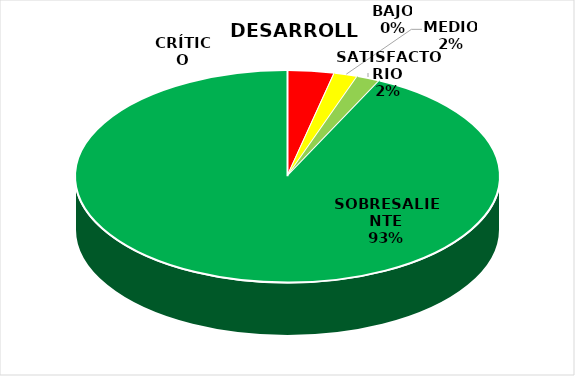
| Category | Series 2 | Series 1 | Series 0 |
|---|---|---|---|
| CRÍTICO | 2 | 0 | 2 |
| BAJO | 0 | 2 | 0 |
| MEDIO | 1 | 6 | 1 |
| SATISFACTORIO | 1 | 6 | 1 |
| SOBRESALIENTE | 52 | 9 | 52 |